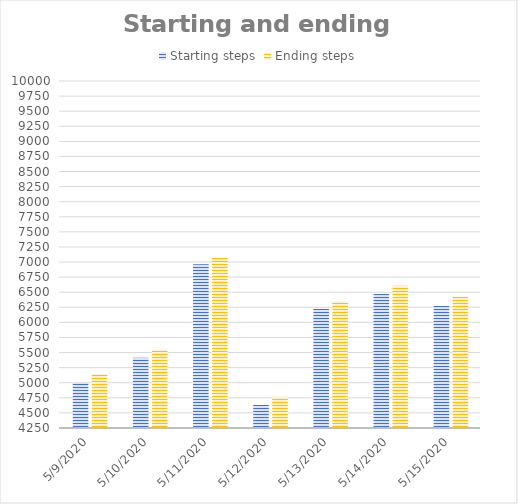
| Category | Starting steps | Ending steps |
|---|---|---|
| 5/9/20 | 5003 | 5143 |
| 5/10/20 | 5416 | 5549 |
| 5/11/20 | 6964 | 7066 |
| 5/12/20 | 4632 | 4766 |
| 5/13/20 | 6226 | 6349 |
| 5/14/20 | 6472 | 6609 |
| 5/15/20 | 6270 | 6427 |